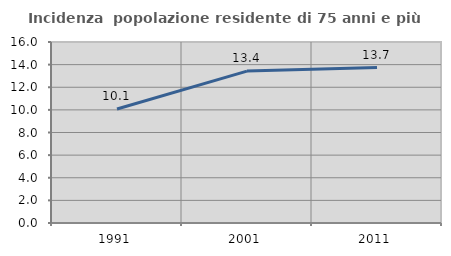
| Category | Incidenza  popolazione residente di 75 anni e più |
|---|---|
| 1991.0 | 10.078 |
| 2001.0 | 13.43 |
| 2011.0 | 13.743 |